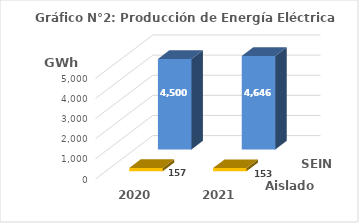
| Category | Aislados | SEIN |
|---|---|---|
| 2020.0 | 157.284 | 4500.281 |
| 2021.0 | 153.169 | 4646.486 |